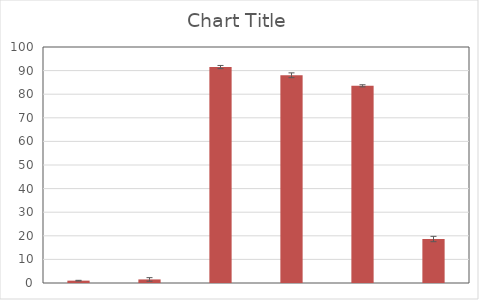
| Category | Series 1 |
|---|---|
| 0 | 1 |
| 1 | 1.514 |
| 2 | 91.505 |
| 3 | 88.019 |
| 4 | 83.556 |
| 5 | 18.635 |